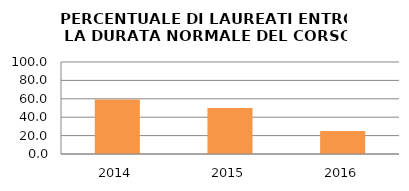
| Category | 2014 2015 2016 |
|---|---|
| 2014.0 | 59.259 |
| 2015.0 | 50 |
| 2016.0 | 25 |